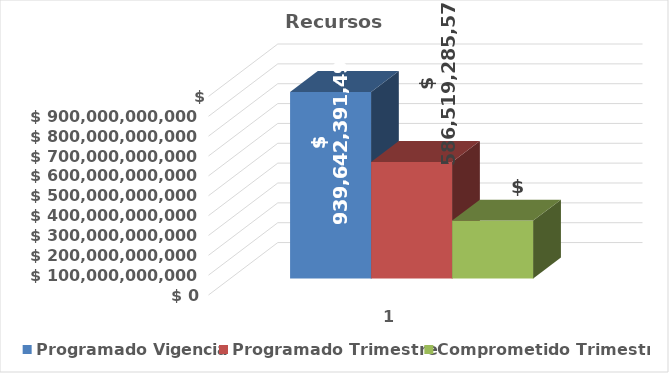
| Category | Programado Vigencia | Programado Trimestre | Comprometido Trimestre |
|---|---|---|---|
| 0 | 939642391498 | 586519285579 | 291461650849 |